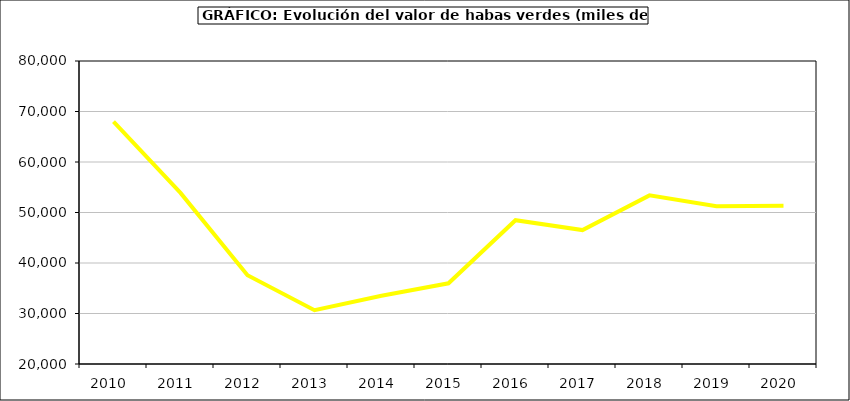
| Category | Valor |
|---|---|
| 2010.0 | 67988.319 |
| 2011.0 | 53880.612 |
| 2012.0 | 37566.616 |
| 2013.0 | 30653.095 |
| 2014.0 | 33509.136 |
| 2015.0 | 35980 |
| 2016.0 | 48480 |
| 2017.0 | 46515.376 |
| 2018.0 | 53389.01 |
| 2019.0 | 51247.117 |
| 2020.0 | 51358.243 |